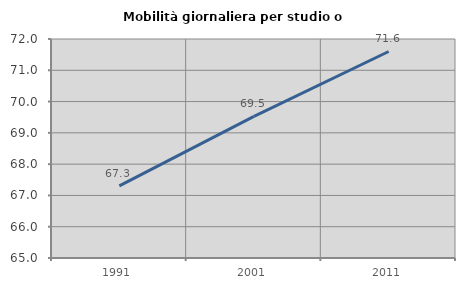
| Category | Mobilità giornaliera per studio o lavoro |
|---|---|
| 1991.0 | 67.308 |
| 2001.0 | 69.526 |
| 2011.0 | 71.601 |